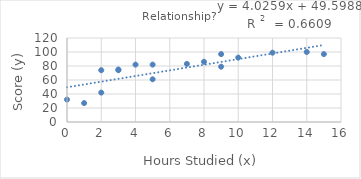
| Category | Score on Final (y Dependent) |
|---|---|
| 5.0 | 82 |
| 2.0 | 74 |
| 15.0 | 97 |
| 3.0 | 75 |
| 14.0 | 100 |
| 0.0 | 32 |
| 4.0 | 82 |
| 3.0 | 74 |
| 8.0 | 86 |
| 9.0 | 97 |
| 12.0 | 99 |
| 10.0 | 92 |
| 2.0 | 42 |
| 1.0 | 27 |
| 9.0 | 79 |
| 7.0 | 83 |
| 5.0 | 61 |